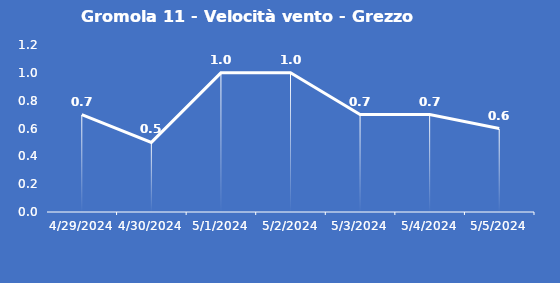
| Category | Gromola 11 - Velocità vento - Grezzo (m/s) |
|---|---|
| 4/29/24 | 0.7 |
| 4/30/24 | 0.5 |
| 5/1/24 | 1 |
| 5/2/24 | 1 |
| 5/3/24 | 0.7 |
| 5/4/24 | 0.7 |
| 5/5/24 | 0.6 |